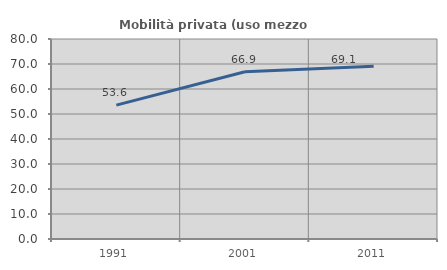
| Category | Mobilità privata (uso mezzo privato) |
|---|---|
| 1991.0 | 53.558 |
| 2001.0 | 66.879 |
| 2011.0 | 69.075 |